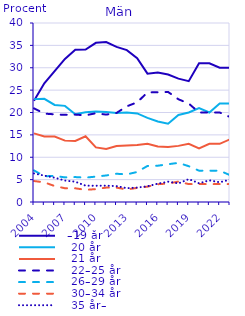
| Category |   –19 år |    20 år |    21 år |    22–25 år |    26–29 år |    30–34 år |    35 år– |
|---|---|---|---|---|---|---|---|
| 2004.0 | 22.612 | 22.989 | 15.34 | 20.925 | 7.058 | 4.686 | 6.39 |
| 2005.0 | 26.512 | 23.061 | 14.643 | 19.75 | 5.747 | 4.389 | 5.896 |
| 2006.0 | 29.259 | 21.695 | 14.612 | 19.591 | 5.844 | 3.568 | 5.431 |
| 2007.0 | 31.967 | 21.484 | 13.715 | 19.469 | 5.5 | 3.078 | 4.787 |
| 2008.0 | 34.022 | 19.625 | 13.651 | 19.531 | 5.57 | 3.064 | 4.538 |
| 2009.0 | 34.078 | 20.032 | 14.699 | 19.375 | 5.451 | 2.718 | 3.647 |
| 2010.0 | 35.57 | 20.203 | 12.208 | 19.836 | 5.671 | 2.878 | 3.633 |
| 2011.0 | 35.732 | 20.105 | 11.838 | 19.528 | 5.931 | 3.215 | 3.652 |
| 2012.0 | 34.661 | 19.872 | 12.491 | 19.907 | 6.311 | 3.213 | 3.546 |
| 2013.0 | 33.929 | 20.019 | 12.606 | 21.382 | 6.176 | 2.798 | 3.09 |
| 2014.0 | 32.132 | 19.797 | 12.714 | 22.279 | 6.704 | 3.153 | 3.22 |
| 2015.0 | 28.682 | 18.791 | 13.034 | 24.49 | 8.057 | 3.428 | 3.518 |
| 2016.0 | 28.911 | 17.992 | 12.399 | 24.518 | 8.108 | 3.977 | 4.096 |
| 2017.0 | 28.5 | 17.498 | 12.303 | 24.589 | 8.439 | 4.123 | 4.549 |
| 2018.0 | 27.568 | 19.463 | 12.543 | 22.959 | 8.748 | 4.559 | 4.16 |
| 2019.0 | 27 | 20 | 13 | 22 | 8 | 4 | 5.115 |
| 2020.0 | 31 | 21 | 12 | 20 | 7 | 4 | 4.182 |
| 2021.0 | 31 | 20 | 13 | 20 | 7 | 4 | 4.84 |
| 2022.0 | 30 | 22 | 13 | 20 | 7 | 4 | 4.406 |
| 2023.0 | 30 | 22 | 14 | 19 | 6 | 4 | 5 |